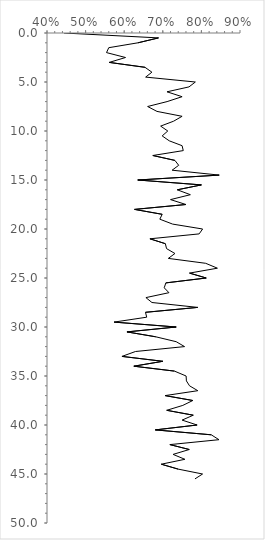
| Category | Series 0 |
|---|---|
| 0.44385026737967914 | 0 |
| 0.6888888888888889 | 0.5 |
| 0.6356589147286822 | 1 |
| 0.56 | 1.5 |
| 0.5542168674698795 | 2 |
| 0.603448275862069 | 2.5 |
| 0.5612244897959183 | 3 |
| 0.6538461538461539 | 3.5 |
| 0.6717557251908397 | 4 |
| 0.6555555555555556 | 4.5 |
| 0.7843137254901961 | 5 |
| 0.7678571428571429 | 5.5 |
| 0.7108433734939759 | 6 |
| 0.75 | 6.5 |
| 0.7111111111111111 | 7 |
| 0.6607142857142857 | 7.5 |
| 0.684931506849315 | 8 |
| 0.75 | 8.5 |
| 0.728 | 9 |
| 0.6944444444444444 | 9.5 |
| 0.7128712871287128 | 10 |
| 0.6984126984126984 | 10.5 |
| 0.7166666666666667 | 11 |
| 0.75 | 11.5 |
| 0.7530120481927711 | 12 |
| 0.6741573033707865 | 12.5 |
| 0.7313432835820896 | 13 |
| 0.7411764705882353 | 13.5 |
| 0.7241379310344828 | 14 |
| 0.8461538461538461 | 14.5 |
| 0.6351351351351351 | 15 |
| 0.8 | 15.5 |
| 0.7375 | 16 |
| 0.7714285714285715 | 16.5 |
| 0.72 | 17 |
| 0.76 | 17.5 |
| 0.6268656716417911 | 18 |
| 0.6984126984126984 | 18.5 |
| 0.6923076923076923 | 19 |
| 0.7254901960784313 | 19.5 |
| 0.8031496062992126 | 20 |
| 0.7941176470588235 | 20.5 |
| 0.6666666666666666 | 21 |
| 0.7066666666666667 | 21.5 |
| 0.7096774193548387 | 22 |
| 0.7314814814814815 | 22.5 |
| 0.7142857142857143 | 23 |
| 0.8111111111111111 | 23.5 |
| 0.8414634146341463 | 24 |
| 0.7692307692307693 | 24.5 |
| 0.8125 | 25 |
| 0.7078651685393258 | 25.5 |
| 0.7037037037037037 | 26 |
| 0.7159090909090909 | 26.5 |
| 0.65625 | 27 |
| 0.671875 | 27.5 |
| 0.7904761904761904 | 28 |
| 0.6551724137931034 | 28.5 |
| 0.6583333333333333 | 29 |
| 0.5737704918032787 | 29.5 |
| 0.7346938775510204 | 30 |
| 0.6071428571428571 | 30.5 |
| 0.6818181818181818 | 31 |
| 0.7346938775510204 | 31.5 |
| 0.7564102564102564 | 32 |
| 0.6292134831460674 | 32.5 |
| 0.5942028985507246 | 33 |
| 0.7 | 33.5 |
| 0.625 | 34 |
| 0.7301587301587301 | 34.5 |
| 0.7604166666666666 | 35 |
| 0.7611940298507462 | 35.5 |
| 0.7692307692307693 | 36 |
| 0.7906976744186046 | 36.5 |
| 0.7058823529411765 | 37 |
| 0.7777777777777778 | 37.5 |
| 0.7518796992481203 | 38 |
| 0.7101449275362319 | 38.5 |
| 0.7789473684210526 | 39 |
| 0.75 | 39.5 |
| 0.7888888888888889 | 40 |
| 0.6805555555555556 | 40.5 |
| 0.8255813953488372 | 41 |
| 0.8455284552845529 | 41.5 |
| 0.7183098591549296 | 42 |
| 0.768595041322314 | 42.5 |
| 0.7266666666666667 | 43 |
| 0.7572815533980582 | 43.5 |
| 0.696078431372549 | 44 |
| 0.7395833333333334 | 44.5 |
| 0.803030303030303 | 45 |
| 0.7833333333333333 | 45.5 |